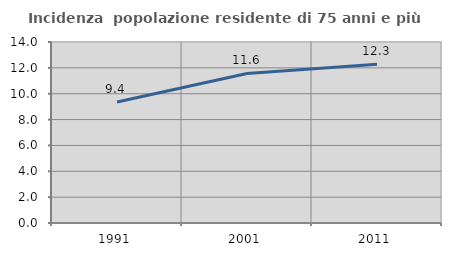
| Category | Incidenza  popolazione residente di 75 anni e più |
|---|---|
| 1991.0 | 9.361 |
| 2001.0 | 11.569 |
| 2011.0 | 12.275 |